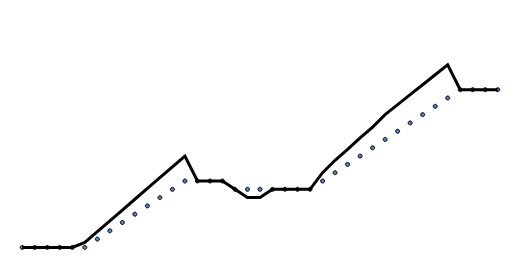
| Category | "Реальная" цена | Рыночная цена |
|---|---|---|
| 0 | 2 | 2 |
| 1 | 2 | 2 |
| 2 | 2 | 2 |
| 3 | 2 | 2 |
| 4 | 2 | 2 |
| 5 | 2 | 2.6 |
| 6 | 3 | 3.9 |
| 7 | 4 | 5.2 |
| 8 | 5 | 6.5 |
| 9 | 6 | 7.8 |
| 10 | 7 | 9.1 |
| 11 | 8 | 10.4 |
| 12 | 9 | 11.7 |
| 13 | 10 | 13 |
| 14 | 10 | 10 |
| 15 | 10 | 10 |
| 16 | 10 | 10 |
| 17 | 9 | 9 |
| 18 | 9 | 8 |
| 19 | 9 | 8 |
| 20 | 9 | 9 |
| 21 | 9 | 9 |
| 22 | 9 | 9 |
| 23 | 9 | 9 |
| 24 | 10 | 11 |
| 25 | 11 | 12.5 |
| 26 | 12 | 13.8 |
| 27 | 13 | 15.2 |
| 28 | 14 | 16.5 |
| 29 | 15 | 18 |
| 30 | 16 | 19.2 |
| 31 | 17 | 20.4 |
| 32 | 18 | 21.6 |
| 33 | 19 | 22.8 |
| 34 | 20 | 24 |
| 35 | 21 | 21 |
| 36 | 21 | 21 |
| 37 | 21 | 21 |
| 38 | 21 | 21 |